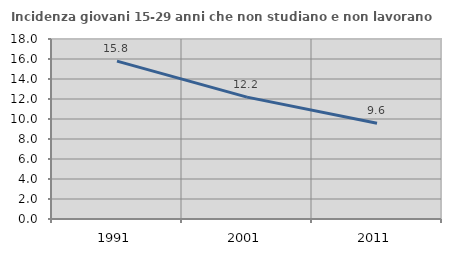
| Category | Incidenza giovani 15-29 anni che non studiano e non lavorano  |
|---|---|
| 1991.0 | 15.79 |
| 2001.0 | 12.186 |
| 2011.0 | 9.579 |